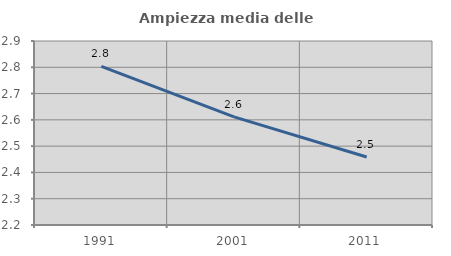
| Category | Ampiezza media delle famiglie |
|---|---|
| 1991.0 | 2.803 |
| 2001.0 | 2.611 |
| 2011.0 | 2.459 |